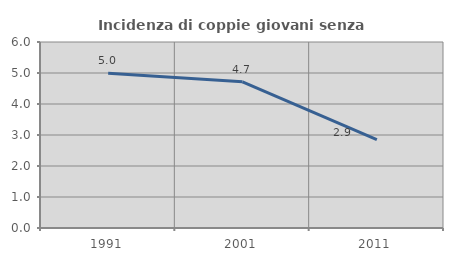
| Category | Incidenza di coppie giovani senza figli |
|---|---|
| 1991.0 | 4.994 |
| 2001.0 | 4.718 |
| 2011.0 | 2.853 |